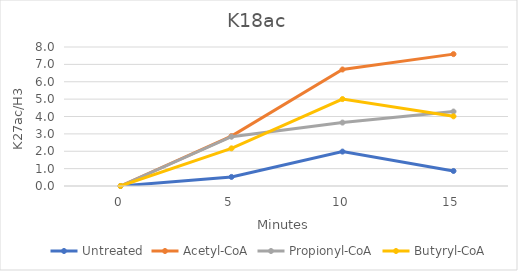
| Category | Untreated | Acetyl-CoA | Propionyl-CoA | Butyryl-CoA |
|---|---|---|---|---|
| 0.0 | 0 | 0 | 0 | 0 |
| 5.0 | 0.522 | 2.87 | 2.837 | 2.167 |
| 10.0 | 1.98 | 6.705 | 3.65 | 5.003 |
| 15.0 | 0.864 | 7.591 | 4.285 | 4.01 |